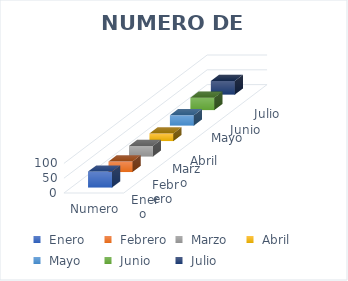
| Category | Series 0 | Series 1 | Series 2 | Series 3 | Series 4 | Series 5 | Series 6 |
|---|---|---|---|---|---|---|---|
| Numero de entierros | 54 | 36 | 36 | 26 | 35 | 42 | 46 |